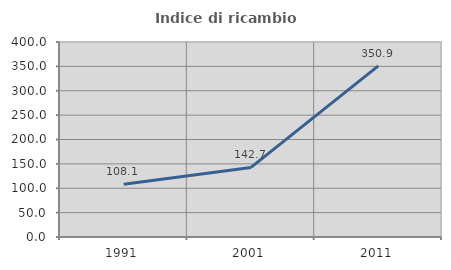
| Category | Indice di ricambio occupazionale  |
|---|---|
| 1991.0 | 108.054 |
| 2001.0 | 142.745 |
| 2011.0 | 350.932 |